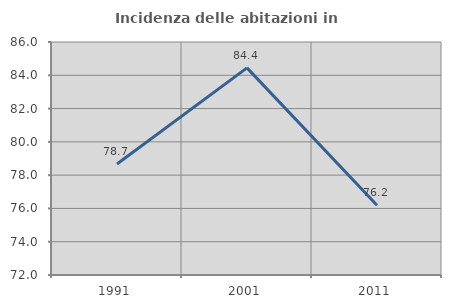
| Category | Incidenza delle abitazioni in proprietà  |
|---|---|
| 1991.0 | 78.667 |
| 2001.0 | 84.444 |
| 2011.0 | 76.19 |